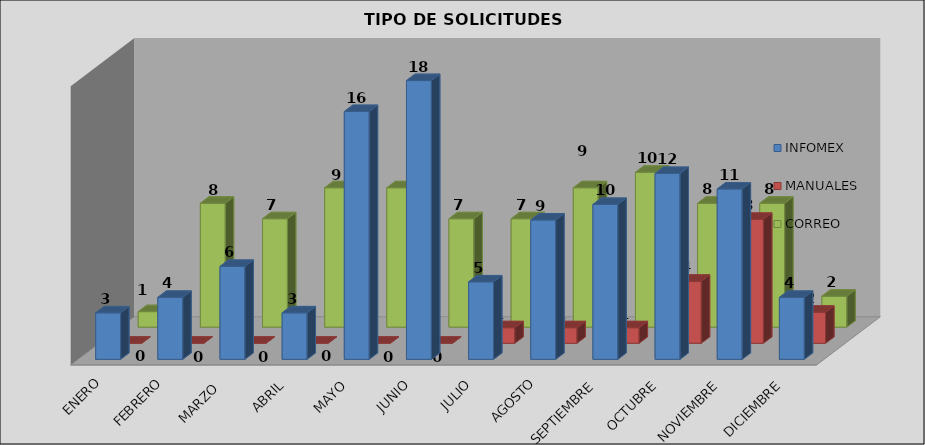
| Category | INFOMEX | MANUALES | CORREO |
|---|---|---|---|
| ENERO | 3 | 0 | 1 |
| FEBRERO | 4 | 0 | 8 |
| MARZO  | 6 | 0 | 7 |
| ABRIL | 3 | 0 | 9 |
| MAYO | 16 | 0 | 9 |
| JUNIO | 18 | 0 | 7 |
| JULIO | 5 | 1 | 7 |
| AGOSTO | 9 | 1 | 9 |
| SEPTIEMBRE | 10 | 1 | 10 |
| OCTUBRE | 12 | 4 | 8 |
| NOVIEMBRE | 11 | 8 | 8 |
| DICIEMBRE | 4 | 2 | 2 |